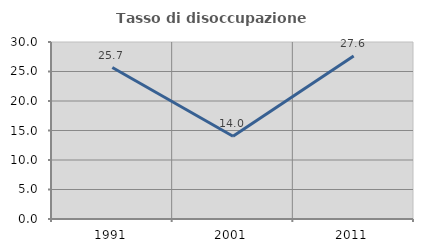
| Category | Tasso di disoccupazione giovanile  |
|---|---|
| 1991.0 | 25.668 |
| 2001.0 | 14.024 |
| 2011.0 | 27.619 |